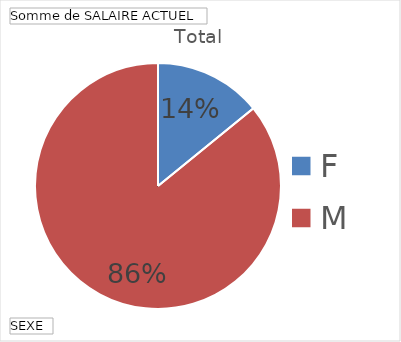
| Category | Total |
|---|---|
| F | 0.141 |
| M | 0.859 |